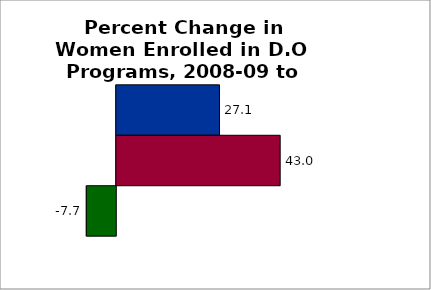
| Category | 50 states and D.C. | SREB states | State |
|---|---|---|---|
| 0 | 27.058 | 42.97 | -7.733 |